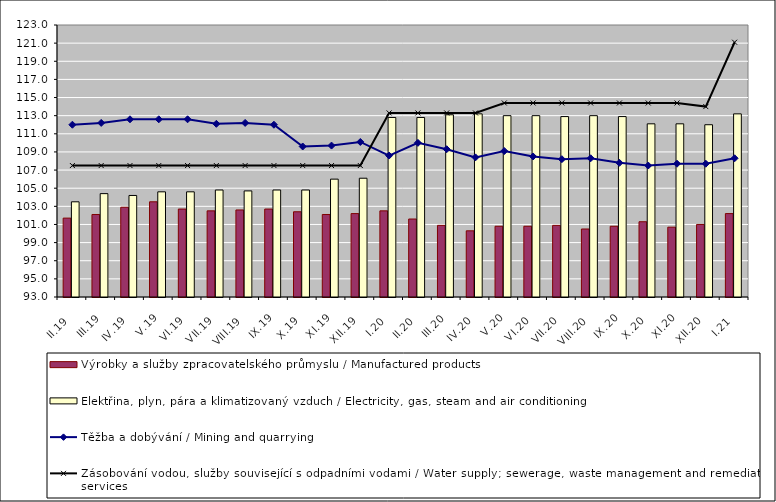
| Category | Výrobky a služby zpracovatelského průmyslu / Manufactured products | Elektřina, plyn, pára a klimatizovaný vzduch / Electricity, gas, steam and air conditioning |
|---|---|---|
| II.19 | 101.7 | 103.5 |
| III.19 | 102.1 | 104.4 |
| IV.19 | 102.9 | 104.2 |
| V.19 | 103.5 | 104.6 |
| VI.19 | 102.7 | 104.6 |
| VII.19 | 102.5 | 104.8 |
| VIII.19 | 102.6 | 104.7 |
| IX.19 | 102.7 | 104.8 |
| X.19 | 102.4 | 104.8 |
| XI.19 | 102.1 | 106 |
| XII.19 | 102.2 | 106.1 |
| I.20 | 102.5 | 112.8 |
| II.20 | 101.6 | 112.8 |
| III.20 | 100.9 | 113.1 |
| IV.20 | 100.3 | 113.2 |
| V.20 | 100.8 | 113 |
| VI.20 | 100.8 | 113 |
| VII.20 | 100.9 | 112.9 |
| VIII.20 | 100.5 | 113 |
| IX.20 | 100.8 | 112.9 |
| X.20 | 101.3 | 112.1 |
| XI.20 | 100.7 | 112.1 |
| XII.20 | 101 | 112 |
| I.21 | 102.2 | 113.2 |